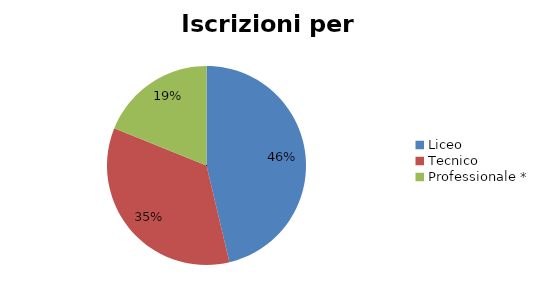
| Category | Series 0 |
|---|---|
| Liceo  | 17445 |
| Tecnico | 13121 |
| Professionale * | 7115 |